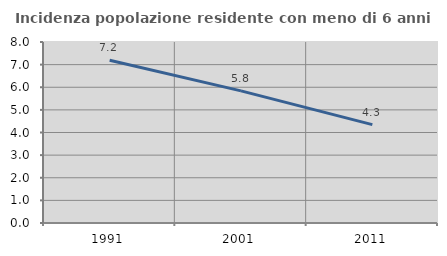
| Category | Incidenza popolazione residente con meno di 6 anni |
|---|---|
| 1991.0 | 7.194 |
| 2001.0 | 5.839 |
| 2011.0 | 4.348 |